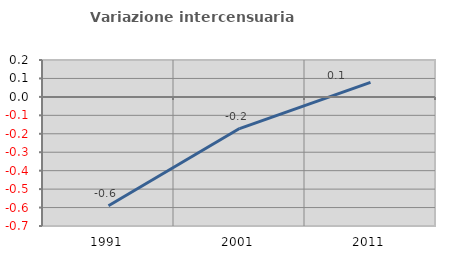
| Category | Variazione intercensuaria annua |
|---|---|
| 1991.0 | -0.59 |
| 2001.0 | -0.172 |
| 2011.0 | 0.079 |